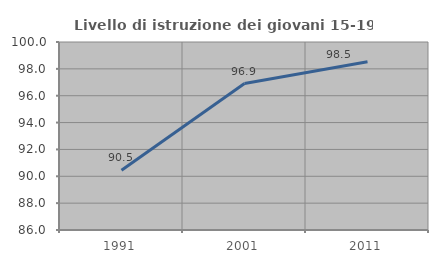
| Category | Livello di istruzione dei giovani 15-19 anni |
|---|---|
| 1991.0 | 90.452 |
| 2001.0 | 96.907 |
| 2011.0 | 98.526 |